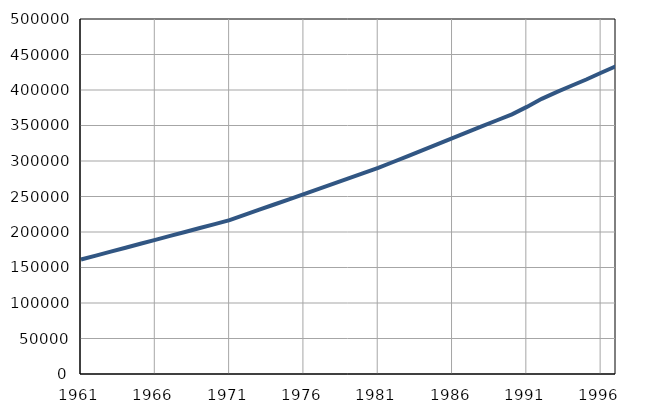
| Category | Број
становника |
|---|---|
| 1961.0 | 161261 |
| 1962.0 | 166801 |
| 1963.0 | 172341 |
| 1964.0 | 177881 |
| 1965.0 | 183421 |
| 1966.0 | 188961 |
| 1967.0 | 194501 |
| 1968.0 | 200041 |
| 1969.0 | 205581 |
| 1970.0 | 211121 |
| 1971.0 | 216668 |
| 1972.0 | 224021 |
| 1973.0 | 231374 |
| 1974.0 | 238727 |
| 1975.0 | 246080 |
| 1976.0 | 253433 |
| 1977.0 | 260786 |
| 1978.0 | 268139 |
| 1979.0 | 275492 |
| 1980.0 | 282845 |
| 1981.0 | 290192 |
| 1982.0 | 298589 |
| 1983.0 | 306986 |
| 1984.0 | 315383 |
| 1985.0 | 323780 |
| 1986.0 | 332177 |
| 1987.0 | 340574 |
| 1988.0 | 348971 |
| 1989.0 | 357368 |
| 1990.0 | 365765 |
| 1991.0 | 376200 |
| 1992.0 | 387600 |
| 1993.0 | 397100 |
| 1994.0 | 406000 |
| 1995.0 | 414800 |
| 1996.0 | 424300 |
| 1997.0 | 433600 |